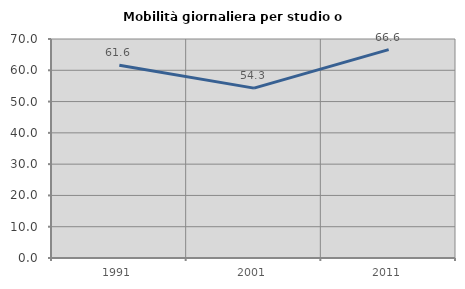
| Category | Mobilità giornaliera per studio o lavoro |
|---|---|
| 1991.0 | 61.614 |
| 2001.0 | 54.303 |
| 2011.0 | 66.587 |